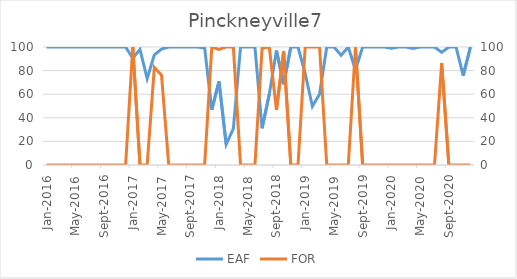
| Category | EAF |
|---|---|
| 2016-01-01 | 100 |
| 2016-02-01 | 100 |
| 2016-03-01 | 100 |
| 2016-04-01 | 100 |
| 2016-05-01 | 100 |
| 2016-06-01 | 100 |
| 2016-07-01 | 100 |
| 2016-08-01 | 100 |
| 2016-09-01 | 100 |
| 2016-10-01 | 100 |
| 2016-11-01 | 100 |
| 2016-12-01 | 100 |
| 2017-01-01 | 90.46 |
| 2017-02-01 | 98 |
| 2017-03-01 | 73.26 |
| 2017-04-01 | 93.34 |
| 2017-05-01 | 98.29 |
| 2017-06-01 | 100 |
| 2017-07-01 | 100 |
| 2017-08-01 | 100 |
| 2017-09-01 | 100 |
| 2017-10-01 | 100 |
| 2017-11-01 | 99.24 |
| 2017-12-01 | 46.84 |
| 2018-01-01 | 70.82 |
| 2018-02-01 | 17.44 |
| 2018-03-01 | 30.84 |
| 2018-04-01 | 100 |
| 2018-05-01 | 100 |
| 2018-06-01 | 100 |
| 2018-07-01 | 31.12 |
| 2018-08-01 | 59.91 |
| 2018-09-01 | 97.03 |
| 2018-10-01 | 68.5 |
| 2018-11-01 | 100 |
| 2018-12-01 | 100 |
| 2019-01-01 | 77.44 |
| 2019-02-01 | 49.75 |
| 2019-03-01 | 60.03 |
| 2019-04-01 | 100 |
| 2019-05-01 | 100 |
| 2019-06-01 | 93.01 |
| 2019-07-01 | 100 |
| 2019-08-01 | 80.55 |
| 2019-09-01 | 100 |
| 2019-10-01 | 100 |
| 2019-11-01 | 100 |
| 2019-12-01 | 100 |
| 2020-01-01 | 98.95 |
| 2020-02-01 | 100 |
| 2020-03-01 | 100 |
| 2020-04-01 | 98.77 |
| 2020-05-01 | 100 |
| 2020-06-01 | 100 |
| 2020-07-01 | 100 |
| 2020-08-01 | 95.49 |
| 2020-09-01 | 100 |
| 2020-10-01 | 100 |
| 2020-11-01 | 75.73 |
| 2020-12-01 | 100 |